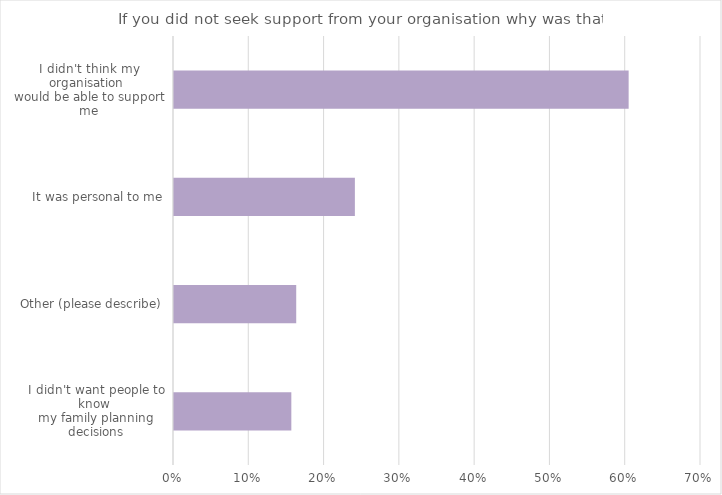
| Category | Series 0 |
|---|---|
| I didn't want people to know 
my family planning decisions | 0.156 |
| Other (please describe) | 0.162 |
| It was personal to me | 0.24 |
| I didn't think my organisation 
would be able to support me | 0.604 |